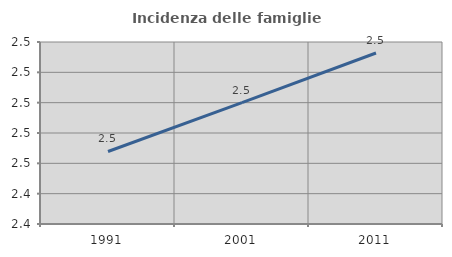
| Category | Incidenza delle famiglie numerose |
|---|---|
| 1991.0 | 2.468 |
| 2001.0 | 2.5 |
| 2011.0 | 2.533 |